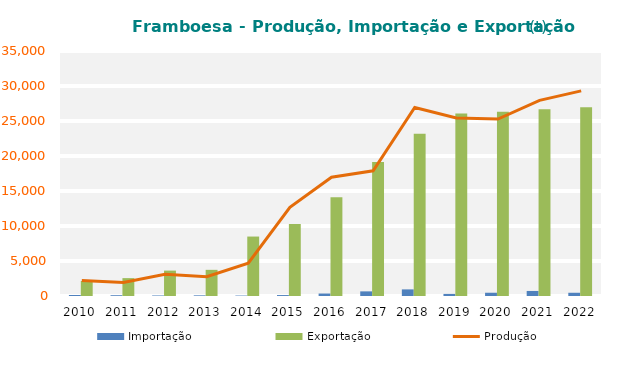
| Category | Importação | Exportação |
|---|---|---|
| 2010 | 143.324 | 2143.956 |
| 2011 | 110.284 | 2553.548 |
| 2012 | 72.915 | 3628.081 |
| 2013 | 90.509 | 3737.581 |
| 2014 | 60.985 | 8492.548 |
| 2015 | 133.783 | 10302.1 |
| 2016 | 351.946 | 14106.674 |
| 2017 | 661.284 | 19144.657 |
| 2018 | 944.477 | 23173.071 |
| 2019 | 298.354 | 26078.801 |
| 2020 | 466.023 | 26325.235 |
| 2021 | 719.738 | 26692.72 |
| 2022 | 462.285 | 26958.237 |